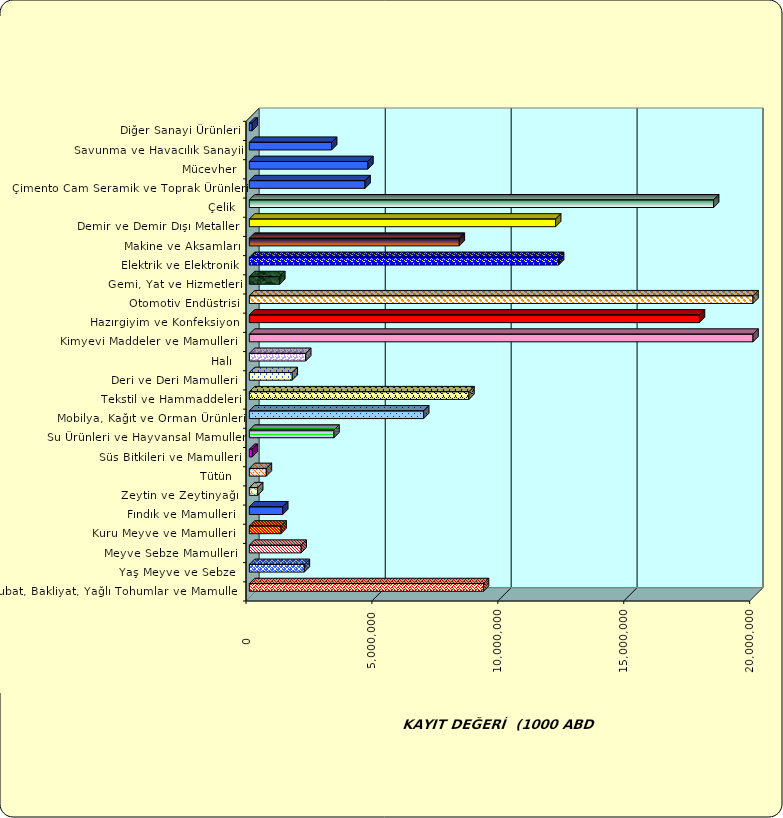
| Category | Series 0 |
|---|---|
|  Hububat, Bakliyat, Yağlı Tohumlar ve Mamulleri  | 9297463.754 |
|  Yaş Meyve ve Sebze   | 2183885.883 |
|  Meyve Sebze Mamulleri  | 2057915.999 |
|  Kuru Meyve ve Mamulleri   | 1259702.497 |
|  Fındık ve Mamulleri  | 1325869.598 |
|  Zeytin ve Zeytinyağı  | 328892.963 |
|  Tütün  | 675288.816 |
|  Süs Bitkileri ve Mamulleri | 114320.61 |
|  Su Ürünleri ve Hayvansal Mamuller | 3359333.362 |
|  Mobilya, Kağıt ve Orman Ürünleri | 6922891.968 |
|  Tekstil ve Hammaddeleri | 8720285.367 |
|  Deri ve Deri Mamulleri  | 1702787.765 |
|  Halı  | 2237996.815 |
|  Kimyevi Maddeler ve Mamulleri   | 28139271.993 |
|  Hazırgiyim ve Konfeksiyon  | 17873148.448 |
|  Otomotiv Endüstrisi | 24969433.652 |
|  Gemi, Yat ve Hizmetleri | 1209221.342 |
|  Elektrik ve Elektronik | 12279556.096 |
|  Makine ve Aksamları | 8336996.571 |
|  Demir ve Demir Dışı Metaller  | 12161597.207 |
|  Çelik | 18435193.785 |
|  Çimento Cam Seramik ve Toprak Ürünleri | 4594507.933 |
|  Mücevher | 4707498.986 |
|  Savunma ve Havacılık Sanayii | 3267256.583 |
|  Diğer Sanayi Ürünleri | 112010.633 |